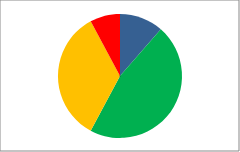
| Category | Series 0 | Series 1 |
|---|---|---|
| Outstanding | 19 | 0.114 |
| Good | 77 | 0.464 |
| RI | 57 | 0.343 |
| Inadequate | 13 | 0.078 |